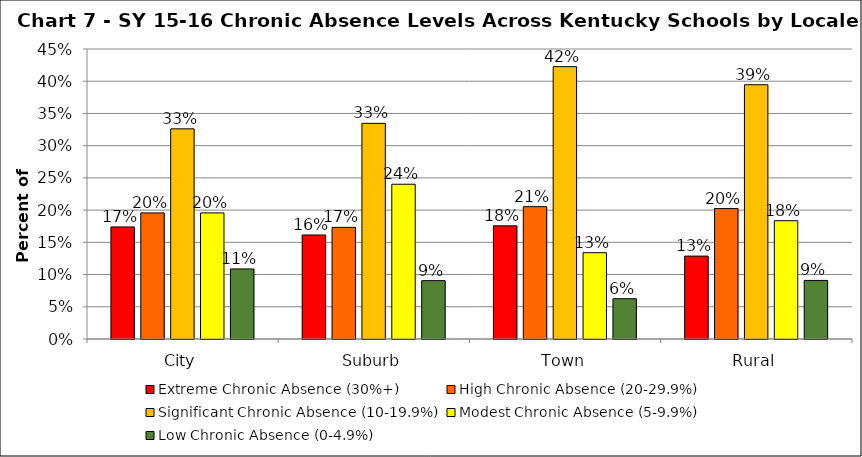
| Category | Extreme Chronic Absence (30%+) | High Chronic Absence (20-29.9%) | Significant Chronic Absence (10-19.9%) | Modest Chronic Absence (5-9.9%) | Low Chronic Absence (0-4.9%) |
|---|---|---|---|---|---|
| 0 | 0.174 | 0.196 | 0.326 | 0.196 | 0.109 |
| 1 | 0.161 | 0.173 | 0.335 | 0.24 | 0.091 |
| 2 | 0.176 | 0.205 | 0.423 | 0.134 | 0.062 |
| 3 | 0.129 | 0.202 | 0.395 | 0.184 | 0.091 |